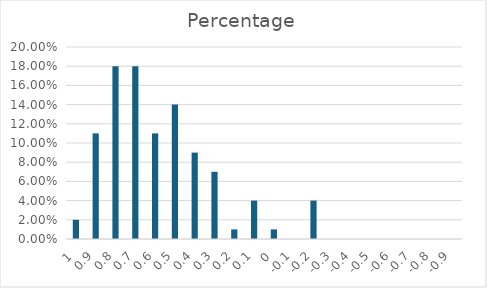
| Category | Series 0 |
|---|---|
| 1.0 | 0.02 |
| 0.9 | 0.11 |
| 0.8 | 0.18 |
| 0.7000000000000001 | 0.18 |
| 0.6000000000000001 | 0.11 |
| 0.5000000000000001 | 0.14 |
| 0.40000000000000013 | 0.09 |
| 0.30000000000000016 | 0.07 |
| 0.20000000000000015 | 0.01 |
| 0.10000000000000014 | 0.04 |
| 0.0 | 0.01 |
| -0.1 | 0 |
| -0.2 | 0.04 |
| -0.30000000000000004 | 0 |
| -0.4 | 0 |
| -0.5 | 0 |
| -0.6 | 0 |
| -0.7 | 0 |
| -0.7999999999999999 | 0 |
| -0.8999999999999999 | 0 |